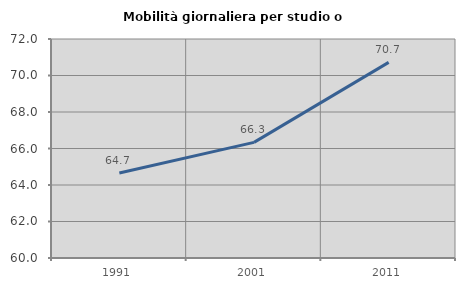
| Category | Mobilità giornaliera per studio o lavoro |
|---|---|
| 1991.0 | 64.655 |
| 2001.0 | 66.335 |
| 2011.0 | 70.721 |